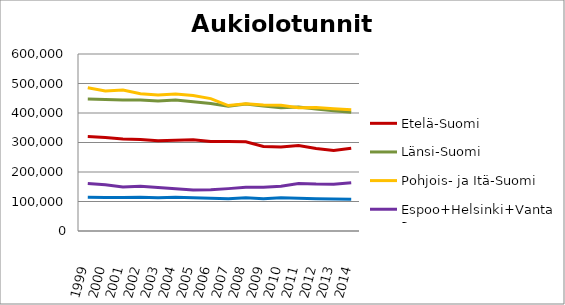
| Category | Etelä-Suomi | Länsi-Suomi | Pohjois- ja Itä-Suomi | Espoo+Helsinki+Vantaa | Muu Uusimaa |
|---|---|---|---|---|---|
| 1999.0 | 319930 | 447483 | 485489 | 161300 | 114542 |
| 2000.0 | 317095 | 446120 | 474305 | 156422 | 113162 |
| 2001.0 | 312101 | 444328 | 477690 | 149022 | 113621 |
| 2002.0 | 309823 | 444021 | 465598 | 152051 | 114106 |
| 2003.0 | 305727.5 | 440516.5 | 460841 | 147543 | 113051 |
| 2004.0 | 307685 | 444166.17 | 464753 | 143519 | 114358.5 |
| 2005.0 | 309696 | 438196 | 459235 | 139357 | 113089 |
| 2006.0 | 303256 | 431857 | 448881 | 140050 | 110815 |
| 2007.0 | 303051 | 422858 | 425304 | 143651 | 109493 |
| 2008.0 | 302423.92 | 430798.98 | 431640.4 | 148051 | 112334.25 |
| 2009.0 | 286577.52 | 423476.9 | 427200.7 | 148664.2 | 109346.8 |
| 2010.0 | 284892.17 | 418076.64 | 426466.96 | 151969.97 | 112403.03 |
| 2011.0 | 289417.25 | 420292.38 | 417758.54 | 160960 | 110927 |
| 2012.0 | 279493.33 | 413327.65 | 418936.3 | 159125 | 109326.41 |
| 2013.0 | 272792.4 | 407884.5 | 414394.02 | 158813.33 | 108308.23 |
| 2014.0 | 280505.15 | 402709.73 | 410768.68 | 163676.24 | 107545.16 |